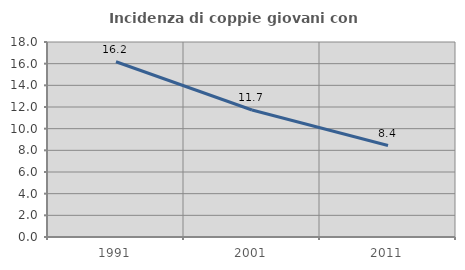
| Category | Incidenza di coppie giovani con figli |
|---|---|
| 1991.0 | 16.176 |
| 2001.0 | 11.724 |
| 2011.0 | 8.442 |